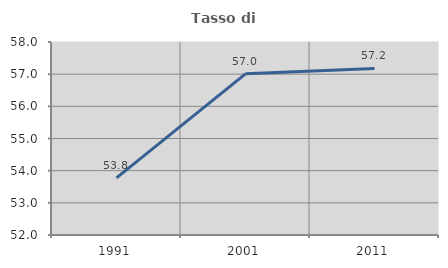
| Category | Tasso di occupazione   |
|---|---|
| 1991.0 | 53.775 |
| 2001.0 | 57.011 |
| 2011.0 | 57.18 |